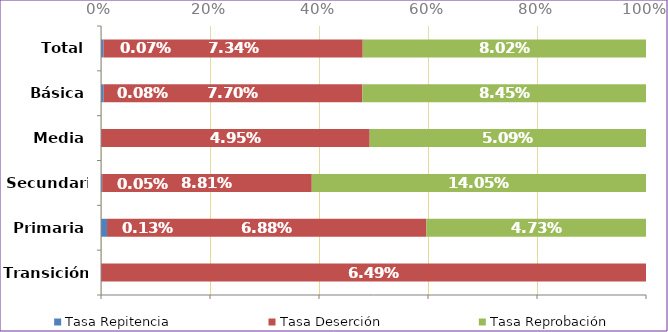
| Category | Tasa Repitencia | Tasa Deserción | Tasa Reprobación |
|---|---|---|---|
| Transición | 0 | 0.065 | 0 |
| Primaria | 0.001 | 0.069 | 0.047 |
| Secundaria | 0 | 0.088 | 0.14 |
| Media | 0 | 0.05 | 0.051 |
| Básica | 0.001 | 0.077 | 0.084 |
| Total | 0.001 | 0.073 | 0.08 |